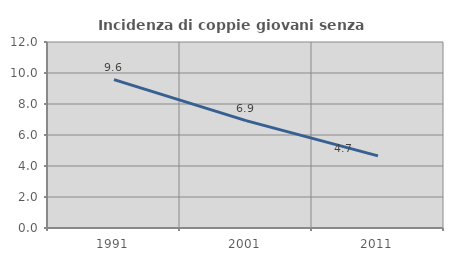
| Category | Incidenza di coppie giovani senza figli |
|---|---|
| 1991.0 | 9.569 |
| 2001.0 | 6.931 |
| 2011.0 | 4.651 |